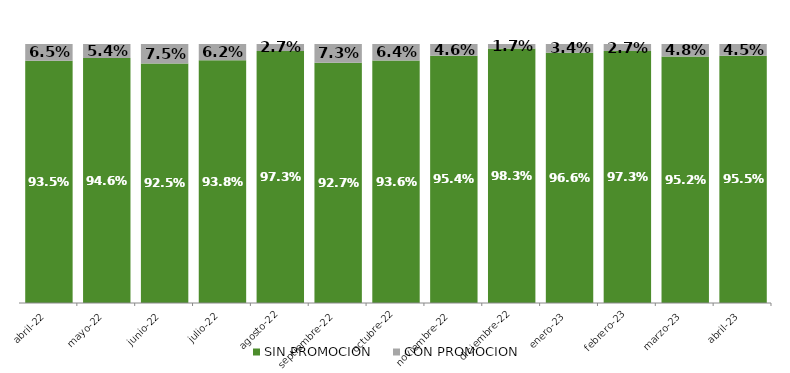
| Category | SIN PROMOCION   | CON PROMOCION   |
|---|---|---|
| 2022-04-01 | 0.935 | 0.065 |
| 2022-05-01 | 0.946 | 0.054 |
| 2022-06-01 | 0.925 | 0.075 |
| 2022-07-01 | 0.938 | 0.062 |
| 2022-08-01 | 0.973 | 0.027 |
| 2022-09-01 | 0.927 | 0.073 |
| 2022-10-01 | 0.936 | 0.064 |
| 2022-11-01 | 0.954 | 0.046 |
| 2022-12-01 | 0.983 | 0.017 |
| 2023-01-01 | 0.966 | 0.034 |
| 2023-02-01 | 0.973 | 0.027 |
| 2023-03-01 | 0.952 | 0.048 |
| 2023-04-01 | 0.955 | 0.045 |